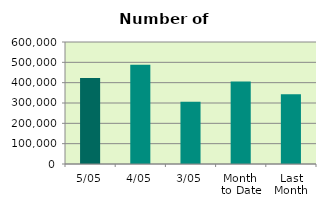
| Category | Series 0 |
|---|---|
| 5/05 | 423232 |
| 4/05 | 488286 |
| 3/05 | 305964 |
| Month 
to Date | 405827.333 |
| Last
Month | 343067.2 |